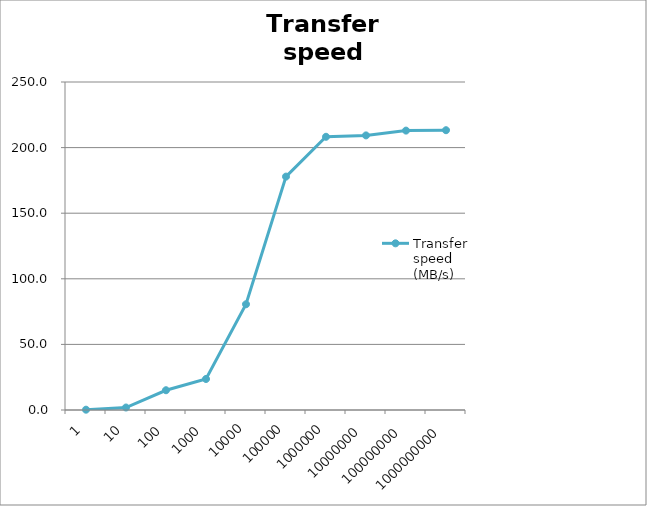
| Category | Transfer
speed (MB/s) |
|---|---|
| 1.0 | 0.246 |
| 10.0 | 1.898 |
| 100.0 | 15.053 |
| 1000.0 | 23.646 |
| 10000.0 | 80.58 |
| 100000.0 | 177.904 |
| 1000000.0 | 208.247 |
| 10000000.0 | 209.293 |
| 100000000.0 | 212.956 |
| 1000000000.0 | 213.248 |